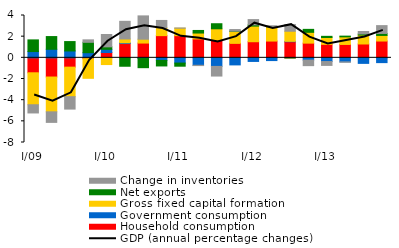
| Category | Household consumption | Government consumption | Gross fixed capital formation | Net exports | Change in inventories |
|---|---|---|---|---|---|
| I/09 | -1.413 | 0.594 | -3.02 | 1.102 | -0.776 |
| II | -1.814 | 0.808 | -3.289 | 1.201 | -0.997 |
| III | -0.879 | 0.65 | -2.791 | 0.886 | -1.173 |
| IV | -0.084 | 0.486 | -1.85 | 0.98 | 0.233 |
| I/10 | 0.5 | 0.305 | -0.636 | 0.234 | 1.168 |
| II | 1.35 | 0.071 | 0.361 | -0.795 | 1.668 |
| III | 1.396 | -0.066 | 0.364 | -0.864 | 2.204 |
| IV | 2.098 | -0.243 | 0.75 | -0.524 | 0.685 |
| I/11 | 2.096 | -0.495 | 0.704 | -0.295 | 0.021 |
| II | 1.789 | -0.704 | 0.554 | 0.244 | -0.028 |
| III | 1.673 | -0.811 | 1.071 | 0.478 | -0.91 |
| IV | 1.366 | -0.668 | 1.14 | 0.019 | 0.149 |
| I/12 | 1.521 | -0.34 | 1.478 | 0.117 | 0.499 |
| II | 1.585 | -0.259 | 1.356 | 0.02 | 0.073 |
| III | 1.521 | 0.037 | 0.954 | -0.017 | 0.637 |
| IV | 1.389 | -0.216 | 1.022 | 0.279 | -0.522 |
| I/13 | 1.276 | -0.35 | 0.645 | 0.111 | -0.365 |
| II | 1.265 | -0.382 | 0.716 | 0.07 | -0.035 |
| III | 1.308 | -0.524 | 0.84 | 0.108 | 0.234 |
| IV | 1.588 | -0.452 | 0.528 | 0.189 | 0.739 |